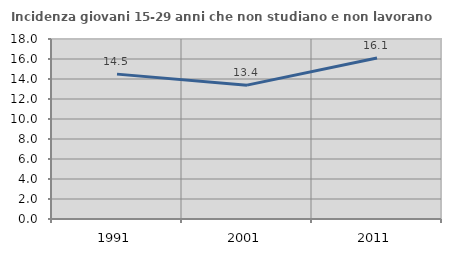
| Category | Incidenza giovani 15-29 anni che non studiano e non lavorano  |
|---|---|
| 1991.0 | 14.488 |
| 2001.0 | 13.385 |
| 2011.0 | 16.105 |